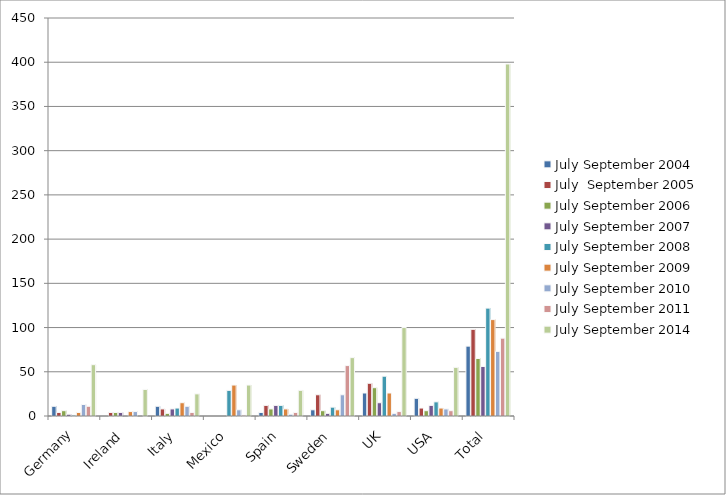
| Category | July September 2004 | July  September 2005 | July September 2006 | July September 2007 | July September 2008 | July September 2009 | July September 2010 | July September 2011 | July September 2014 |
|---|---|---|---|---|---|---|---|---|---|
| Germany | 11 | 4 | 6 | 2 | 1 | 4 | 13 | 11 | 58 |
| Ireland | 0 | 4 | 4 | 4 | 0 | 5 | 5 | 0 | 30 |
| Italy | 11 | 8 | 3 | 8 | 9 | 15 | 11 | 4 | 25 |
| Mexico | 0 | 0 | 0 | 0 | 29 | 35 | 7 | 1 | 35 |
| Spain | 4 | 12 | 8 | 12 | 12 | 8 | 2 | 4 | 29 |
| Sweden | 7 | 24 | 6 | 3 | 10 | 7 | 24 | 57 | 66 |
| UK | 26 | 37 | 32 | 15 | 45 | 26 | 3 | 5 | 100 |
| USA | 20 | 9 | 6 | 12 | 16 | 9 | 8 | 6 | 55 |
| Total | 79 | 98 | 65 | 56 | 122 | 109 | 73 | 88 | 398 |